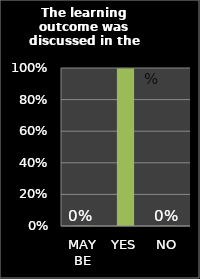
| Category | Series 0 |
|---|---|
| MAY BE | 0.002 |
| YES | 0.997 |
| NO | 0.002 |